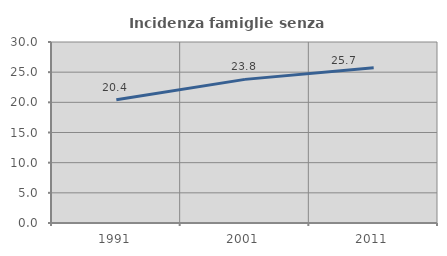
| Category | Incidenza famiglie senza nuclei |
|---|---|
| 1991.0 | 20.416 |
| 2001.0 | 23.805 |
| 2011.0 | 25.714 |